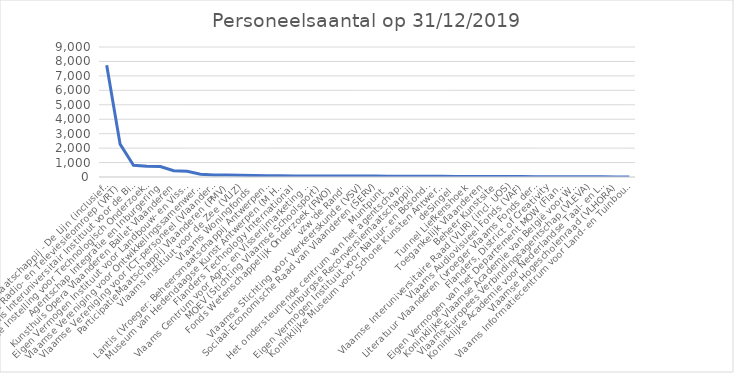
| Category | Personeelsaantal op 31/12/2019 |
|---|---|
| Vlaamse Vervoersmaatschappij - De Lijn (inclusief chauffeurs) | 7734 |
| Vlaamse Radio- en Televiesieomroep (VRT) | 2273 |
| VZW Vlaams Interuniversitair Instituut voor de Biotechnologie (VIB) | 817 |
| Vlaamse Instelling voor Technologisch Onderzoek (VITO) | 751 |
| Agentschap Integratie en Inburgering | 721 |
| Kunsthuis Opera Vlaanderen Ballet Vlaanderen | 433 |
| Eigen Vermogen Instituut voor Landbouw- en Visserijonderzoek | 392 |
| Vlaamse Vereniging voor Ontwikkelingssamenwerking en Technische Bijstand (VVOB) | 195 |
| Vlaamse Vereniging voor ICT-personeel (Vlaanderen Connect.) | 131 |
| ParticipatieMaatschappij Vlaanderen (PMV) | 131 |
| Vlaams Instituut voor de Zee (VLIZ) | 114 |
| Vlaams Woningfonds | 102 |
| Lantis (Vroeger: Beheersmaatschappij Antwerpen Mobiel) | 87 |
| Museum van Hedendaagse Kunst Antwerpen (M HKA) | 82 |
| Flanders Technology International  | 77 |
| Vlaams Centrum voor Agro- en Visserijmarketing (VLAM) | 73 |
| MOEV (Stichting Vlaamse Schoolsport) | 72 |
| Fonds Wetenschappelijk Onderzoek (FWO) | 71 |
| vzw 'de Rand' | 69 |
| Vlaamse Stichting voor Verkeerskunde (VSV) | 64 |
| Sociaal-Economische Raad van Vlaanderen (SERV) | 62 |
| Muntpunt | 58 |
| Het ondersteunende centrum van het agentschap natuur- en bosonderzoek (Natuur Invest) | 55 |
| Limburgse Reconversiemaatschappij | 52 |
| Eigen Vermogen Instituut voor Natuur- en Bosonderzoek (INBO) | 47 |
| Koninklijke Museum voor Schone Kunsten Antwerpen (KMSKA) - vanaf 1/1/2020 (personeelsaantal op 31/12/20) | 45 |
| deSingel | 43 |
| Tunnel Liefkenshoek | 43 |
| Toegankelijk Vlaanderen | 38 |
| Beheer Kunstsite | 36 |
| Vlaamse Interuniversitaire Raad (VLIR) (incl. UOS) | 35 |
| Vlaams Audiovisueel Fonds (VAF) | 27 |
| Literatuur Vlaanderen (vroeger Vlaams Fonds der Letteren) | 19 |
| Flanders, District of Creativity | 18 |
| Eigen Vermogen van het Departement MOW (Flanders Hydraulics) | 15 |
| Koninklijke Vlaamse Academie van België voor Wetenschappen en Kunsten (KVAB) | 12 |
| Vlaams-Europees Verbindingsagentschap (VLEVA) | 10 |
| Koninklijke Academie voor Nederlandse Taal- en Letterkunde (KANTL) | 9 |
| Vlaamse Hogescholenraad (VLHORA) | 8 |
| Vlaams Informatiecentrum voor Land- en Tuinbouw (VILT) | 3 |